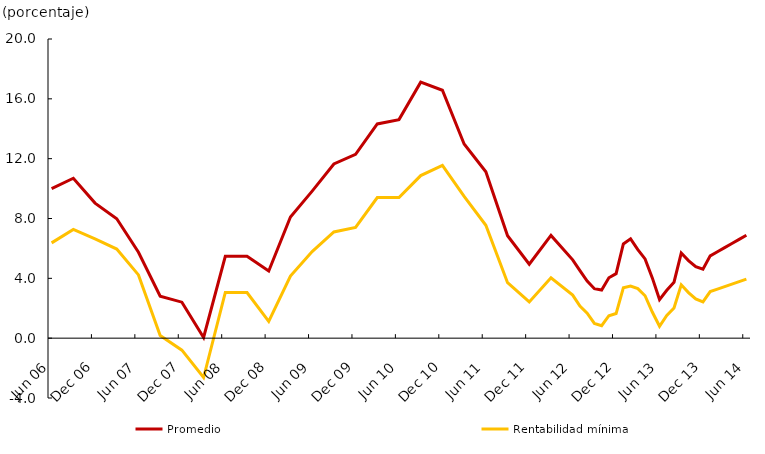
| Category | Promedio | Rentabilidad mínima |
|---|---|---|
| 2006-03-01 | 14.53 | 9.94 |
| 2006-06-01 | 10 | 6.37 |
| 2006-09-01 | 10.69 | 7.27 |
| 2006-12-01 | 9.03 | 6.63 |
| 2007-03-01 | 7.98 | 5.96 |
| 2007-06-01 | 5.74 | 4.23 |
| 2007-09-01 | 2.8 | 0.18 |
| 2007-12-01 | 2.406 | -0.8 |
| 2008-03-01 | 0.048 | -2.633 |
| 2008-06-01 | 5.473 | 3.054 |
| 2008-09-01 | 5.473 | 3.054 |
| 2008-12-01 | 4.485 | 1.128 |
| 2009-03-01 | 8.096 | 4.151 |
| 2009-06-01 | 9.831 | 5.793 |
| 2009-09-01 | 11.645 | 7.103 |
| 2009-12-01 | 12.29 | 7.408 |
| 2010-03-01 | 14.32 | 9.397 |
| 2010-06-01 | 14.611 | 9.399 |
| 2010-09-01 | 17.113 | 10.867 |
| 2010-12-01 | 16.572 | 11.556 |
| 2011-03-01 | 12.984 | 9.472 |
| 2011-06-01 | 11.126 | 7.546 |
| 2011-09-01 | 6.851 | 3.705 |
| 2011-12-01 | 4.944 | 2.42 |
| 2012-03-01 | 6.869 | 4.038 |
| 2012-06-01 | 5.239 | 2.88 |
| 2012-07-01 | 4.519 | 2.144 |
| 2012-08-01 | 3.822 | 1.674 |
| 2012-09-01 | 3.31 | 0.988 |
| 2012-10-01 | 3.216 | 0.835 |
| 2012-11-01 | 4.035 | 1.5 |
| 2012-12-01 | 4.312 | 1.646 |
| 2013-01-01 | 6.301 | 3.368 |
| 2013-02-01 | 6.641 | 3.484 |
| 2013-03-01 | 5.925 | 3.316 |
| 2013-04-01 | 5.299 | 2.836 |
| 2013-05-01 | 4.03 | 1.749 |
| 2013-06-01 | 2.58 | 0.798 |
| 2013-07-01 | 3.2 | 1.516 |
| 2013-08-01 | 3.74 | 2.018 |
| 2013-09-01 | 5.69 | 3.566 |
| 2013-10-01 | 5.19 | 3.044 |
| 2013-11-01 | 4.78 | 2.621 |
| 2013-12-01 | 4.61 | 2.422 |
| 2014-01-01 | 5.502 | 3.113 |
| 2014-02-01 | 5.778 | 3.279 |
| 2014-03-01 | 6.055 | 3.445 |
| 2014-04-01 | 6.331 | 3.611 |
| 2014-05-01 | 6.607 | 3.778 |
| 2014-06-01 | 6.883 | 3.944 |